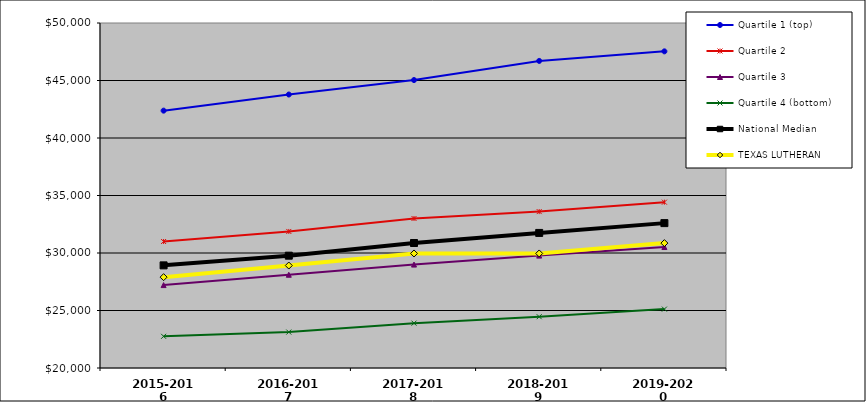
| Category | Quartile 1 (top) | Quartile 2 | Quartile 3 | Quartile 4 (bottom) | National Median |  TEXAS LUTHERAN  |
|---|---|---|---|---|---|---|
| 2015-2016 | 42379 | 31000 | 27210 | 22755 | 28924.5 | 27900 |
| 2016-2017 | 43781 | 31874 | 28110 | 23125 | 29767 | 28910 |
| 2017-2018 | 45039 | 33000 | 28992 | 23900 | 30869 | 29960 |
| 2018-2019 | 46703 | 33600 | 29773 | 24460 | 31745 | 29960 |
| 2019-2020 | 47535 | 34420 | 30520 | 25120 | 32598 | 30860 |